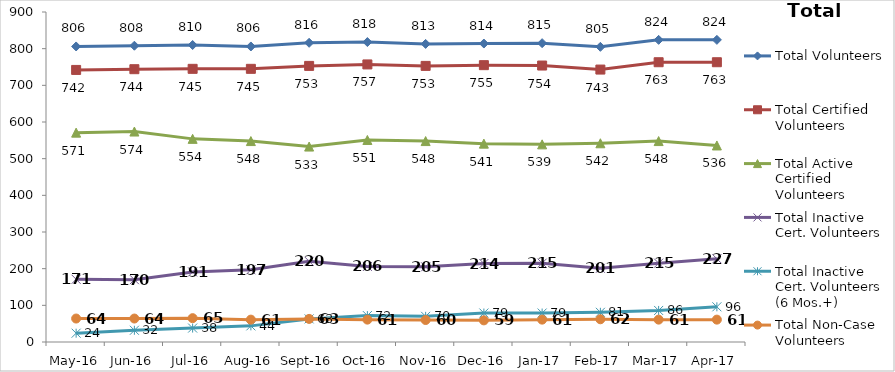
| Category | Total Volunteers | Total Certified Volunteers | Total Active Certified Volunteers | Total Inactive Cert. Volunteers | Total Inactive Cert. Volunteers (6 Mos.+) | Total Non-Case Volunteers |
|---|---|---|---|---|---|---|
| May-16 | 806 | 742 | 571 | 171 | 24 | 64 |
| Jun-16 | 808 | 744 | 574 | 170 | 32 | 64 |
| Jul-16 | 810 | 745 | 554 | 191 | 38 | 65 |
| Aug-16 | 806 | 745 | 548 | 197 | 44 | 61 |
| Sep-16 | 816 | 753 | 533 | 220 | 63 | 63 |
| Oct-16 | 818 | 757 | 551 | 206 | 72 | 61 |
| Nov-16 | 813 | 753 | 548 | 205 | 70 | 60 |
| Dec-16 | 814 | 755 | 541 | 214 | 79 | 59 |
| Jan-17 | 815 | 754 | 539 | 215 | 79 | 61 |
| Feb-17 | 805 | 743 | 542 | 201 | 81 | 62 |
| Mar-17 | 824 | 763 | 548 | 215 | 86 | 61 |
| Apr-17 | 824 | 763 | 536 | 227 | 96 | 61 |